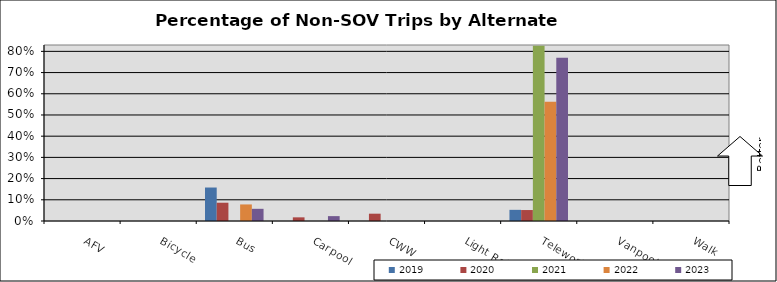
| Category | 2019 | 2020 | 2021 | 2022 | 2023 |
|---|---|---|---|---|---|
| AFV | 0 | 0 | 0 | 0 | 0 |
| Bicycle | 0 | 0 | 0 | 0 | 0 |
| Bus | 0.158 | 0.086 | 0 | 0.078 | 0.057 |
| Carpool | 0 | 0.017 | 0 | 0 | 0.023 |
| CWW | 0 | 0.034 | 0 | 0 | 0 |
| Light Rail | 0 | 0 | 0 | 0 | 0 |
| Telework | 0.053 | 0.052 | 0.827 | 0.562 | 0.77 |
| Vanpool | 0 | 0 | 0 | 0 | 0 |
| Walk | 0 | 0 | 0 | 0 | 0 |